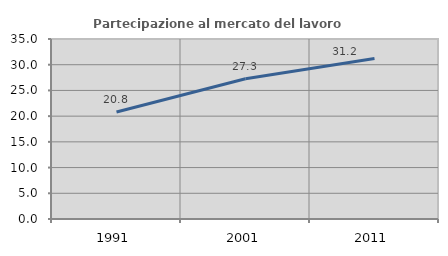
| Category | Partecipazione al mercato del lavoro  femminile |
|---|---|
| 1991.0 | 20.802 |
| 2001.0 | 27.273 |
| 2011.0 | 31.193 |